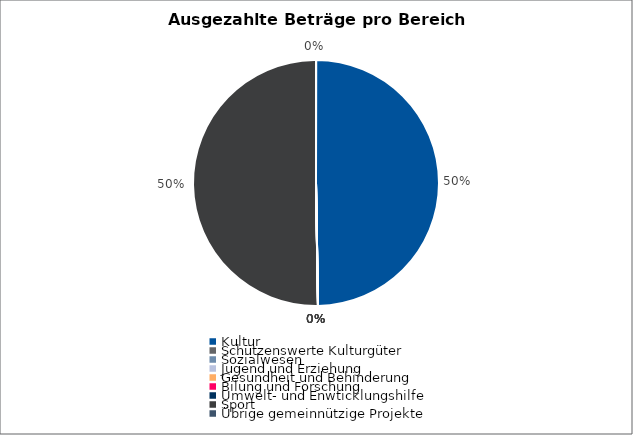
| Category | Series 0 |
|---|---|
| Kultur | 272393.9 |
| Schützenswerte Kulturgüter | 0 |
| Sozialwesen | 0 |
| Jugend und Erziehung | 0 |
| Gesundheit und Behinderung | 0 |
| Bilung und Forschung | 0 |
| Umwelt- und Enwticklungshilfe | 0 |
| Sport | 275286.25 |
| Übrige gemeinnützige Projekte | 0 |